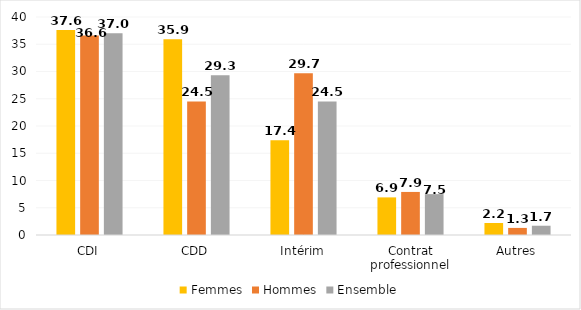
| Category | Femmes | Hommes | Ensemble |
|---|---|---|---|
| CDI | 37.6 | 36.6 | 37 |
| CDD | 35.9 | 24.5 | 29.3 |
| Intérim | 17.4 | 29.7 | 24.5 |
| Contrat professionnel | 6.9 | 7.9 | 7.5 |
| Autres | 2.2 | 1.3 | 1.7 |